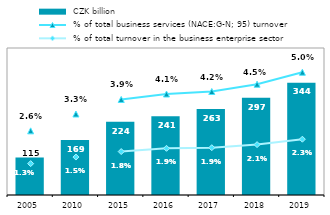
| Category |  CZK billion |
|---|---|
| 2005.0 | 114.905 |
| 2010.0 | 168.518 |
| 2015.0 | 224.002 |
| 2016.0 | 241.04 |
| 2017.0 | 263.002 |
| 2018.0 | 297.334 |
| 2019.0 | 343.519 |